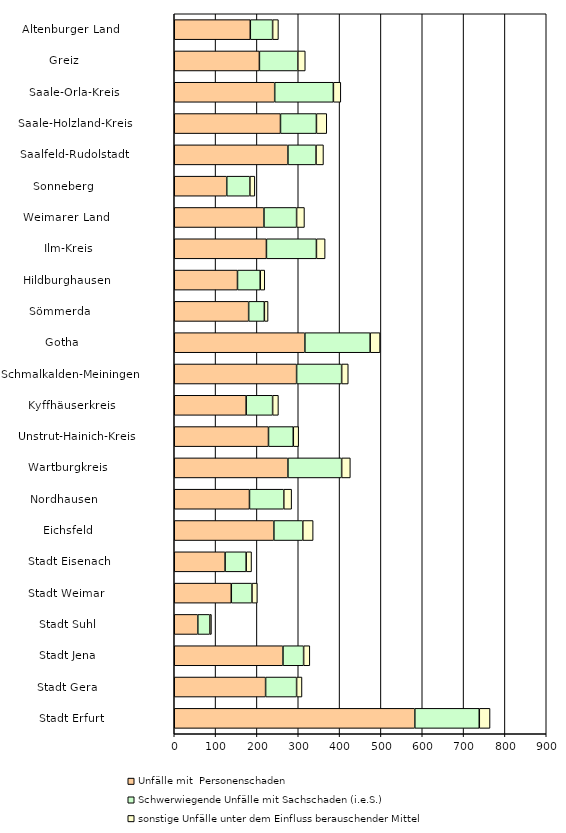
| Category |    Unfälle mit  Personenschaden |    Schwerwiegende Unfälle mit Sachschaden (i.e.S.) |    sonstige Unfälle unter dem Einfluss berauschender Mittel |
|---|---|---|---|
| Stadt Erfurt                   | 582 | 156 | 26 |
| Stadt Gera                     | 221 | 75 | 13 |
| Stadt Jena                     | 263 | 50 | 15 |
| Stadt Suhl                     | 57 | 29 | 4 |
| Stadt Weimar                   | 138 | 50 | 13 |
| Stadt Eisenach                 | 123 | 51 | 13 |
| Eichsfeld                      | 241 | 70 | 25 |
| Nordhausen                     | 182 | 83 | 19 |
| Wartburgkreis                  | 275 | 130 | 21 |
| Unstrut-Hainich-Kreis          | 228 | 60 | 13 |
| Kyffhäuserkreis                | 174 | 64 | 14 |
| Schmalkalden-Meiningen         | 296 | 109 | 16 |
| Gotha                          | 316 | 158 | 24 |
| Sömmerda                       | 180 | 38 | 9 |
| Hildburghausen                 | 153 | 55 | 11 |
| Ilm-Kreis                      | 223 | 121 | 21 |
| Weimarer Land                  | 217 | 79 | 19 |
| Sonneberg                      | 127 | 56 | 12 |
| Saalfeld-Rudolstadt            | 275 | 68 | 18 |
| Saale-Holzland-Kreis           | 257 | 87 | 25 |
| Saale-Orla-Kreis               | 243 | 142 | 18 |
| Greiz                          | 206 | 93 | 18 |
| Altenburger Land               | 184 | 54 | 14 |